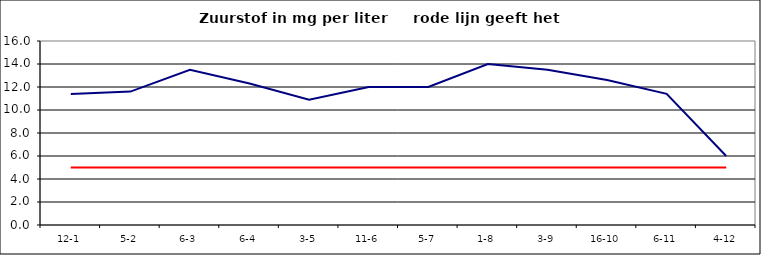
| Category | Series 0 | Series 1 |
|---|---|---|
| 12-1 | 11.4 | 5 |
| 5-2 | 11.6 | 5 |
| 6-3 | 13.5 | 5 |
| 6-4 | 12.3 | 5 |
| 3-5 | 10.9 | 5 |
| 11-6 | 12 | 5 |
| 5-7 | 12 | 5 |
| 1-8 | 14 | 5 |
| 3-9 | 13.5 | 5 |
| 16-10 | 12.6 | 5 |
| 6-11 | 11.4 | 5 |
| 4-12 | 6 | 5 |